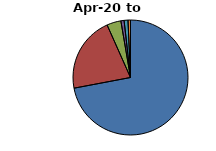
| Category | Percentage of total items
(%) |
|---|---|
| Antibacterial Drugs | 72.023 |
| Fluoride | 21.307 |
| Drugs acting on the oropharynx | 3.98 |
| Non-Steroidal Anti-Inflammatory Drugs (NSAIDs) | 0.907 |
| Analgesics | 1.087 |
| Other | 0.696 |